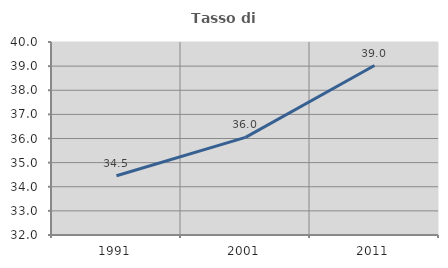
| Category | Tasso di occupazione   |
|---|---|
| 1991.0 | 34.455 |
| 2001.0 | 36.048 |
| 2011.0 | 39.024 |